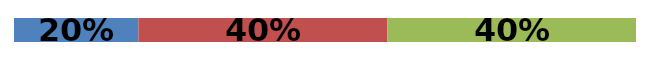
| Category | Series 0 | Series 1 | Series 2 |
|---|---|---|---|
| 0 | 0.2 | 0.4 | 0.4 |